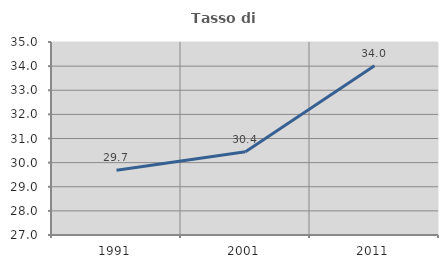
| Category | Tasso di occupazione   |
|---|---|
| 1991.0 | 29.685 |
| 2001.0 | 30.449 |
| 2011.0 | 34.017 |